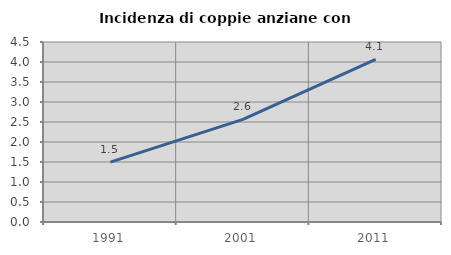
| Category | Incidenza di coppie anziane con figli |
|---|---|
| 1991.0 | 1.498 |
| 2001.0 | 2.566 |
| 2011.0 | 4.065 |